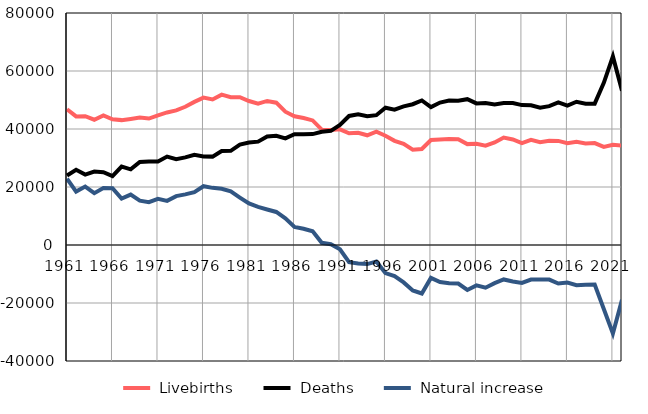
| Category |  Livebirths |  Deaths |  Natural increase |
|---|---|---|---|
| 1961.0 | 46788 | 23930 | 22858 |
| 1962.0 | 44342 | 25923 | 18419 |
| 1963.0 | 44412 | 24268 | 20144 |
| 1964.0 | 43204 | 25319 | 17885 |
| 1965.0 | 44704 | 25086 | 19618 |
| 1966.0 | 43324 | 23724 | 19600 |
| 1967.0 | 43064 | 27030 | 16034 |
| 1968.0 | 43467 | 26079 | 17388 |
| 1969.0 | 43926 | 28639 | 15287 |
| 1970.0 | 43601 | 28826 | 14775 |
| 1971.0 | 44720 | 28796 | 15924 |
| 1972.0 | 45712 | 30498 | 15214 |
| 1973.0 | 46406 | 29561 | 16845 |
| 1974.0 | 47665 | 30198 | 17467 |
| 1975.0 | 49341 | 31096 | 18245 |
| 1976.0 | 50819 | 30547 | 20272 |
| 1977.0 | 50183 | 30476 | 19707 |
| 1978.0 | 51837 | 32438 | 19399 |
| 1979.0 | 50971 | 32470 | 18501 |
| 1980.0 | 50958 | 34601 | 16357 |
| 1981.0 | 49642 | 35329 | 14313 |
| 1982.0 | 48752 | 35636 | 13116 |
| 1983.0 | 49671 | 37430 | 12241 |
| 1984.0 | 49071 | 37676 | 11395 |
| 1985.0 | 45976 | 36768 | 9208 |
| 1986.0 | 44402 | 38201 | 6201 |
| 1987.0 | 43783 | 38193 | 5590 |
| 1988.0 | 42954 | 38252 | 4702 |
| 1989.0 | 39803 | 39056 | 747 |
| 1990.0 | 39640 | 39365 | 275 |
| 1991.0 | 39877 | 41373 | -1496 |
| 1992.0 | 38545 | 44495 | -5950 |
| 1993.0 | 38703 | 45074 | -6371 |
| 1994.0 | 37833 | 44419 | -6586 |
| 1995.0 | 39089 | 44763 | -5674 |
| 1996.0 | 37676 | 47349 | -9673 |
| 1997.0 | 35929 | 46658 | -10729 |
| 1998.0 | 34881 | 47784 | -12903 |
| 1999.0 | 32868 | 48545 | -15677 |
| 2000.0 | 33116 | 49834 | -16718 |
| 2001.0 | 36204 | 47542 | -11338 |
| 2002.0 | 36372 | 49127 | -12755 |
| 2003.0 | 36581 | 49786 | -13205 |
| 2004.0 | 36482 | 49757 | -13275 |
| 2005.0 | 34785 | 50279 | -15494 |
| 2006.0 | 34904 | 48817 | -13913 |
| 2007.0 | 34267 | 48999 | -14732 |
| 2008.0 | 35339 | 48494 | -13155 |
| 2009.0 | 37053 | 48934 | -11881 |
| 2010.0 | 36407 | 48965 | -12558 |
| 2011.0 | 35148 | 48245 | -13097 |
| 2012.0 | 36294 | 48195 | -11901 |
| 2013.0 | 35457 | 47323 | -11866 |
| 2014.0 | 35962 | 47881 | -11919 |
| 2015.0 | 35889 | 49179 | -13290 |
| 2016.0 | 35074 | 48037 | -12963 |
| 2017.0 | 35564 | 49402 | -13838 |
| 2018.0 | 34986 | 48723 | -13737 |
| 2019.0 | 35138 | 48745 | -13607 |
| 2020.0 | 33849 | 55920 | -22071 |
| 2021.0 | 34540 | 65043 | -30503 |
| 2022.0 | 34317 | 53214 | -18897 |